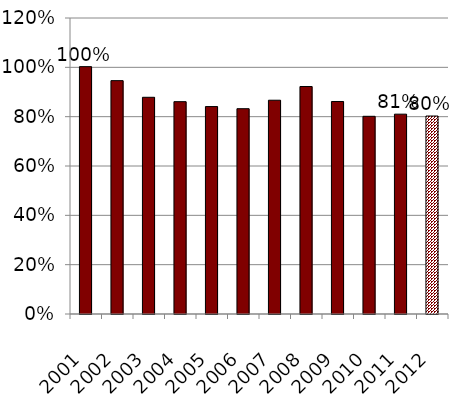
| Category | Series 0 |
|---|---|
| 2001.0 | 1.003 |
| 2002.0 | 0.946 |
| 2003.0 | 0.879 |
| 2004.0 | 0.861 |
| 2005.0 | 0.841 |
| 2006.0 | 0.832 |
| 2007.0 | 0.867 |
| 2008.0 | 0.922 |
| 2009.0 | 0.862 |
| 2010.0 | 0.801 |
| 2011.0 | 0.81 |
| 2012.0 | 0.803 |